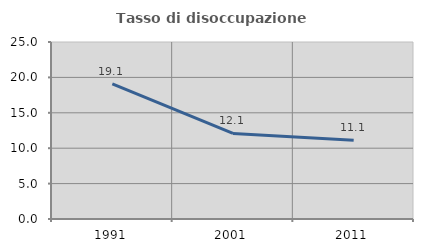
| Category | Tasso di disoccupazione giovanile  |
|---|---|
| 1991.0 | 19.084 |
| 2001.0 | 12.088 |
| 2011.0 | 11.111 |